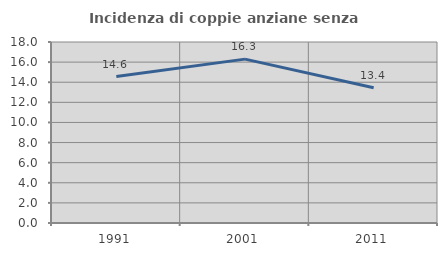
| Category | Incidenza di coppie anziane senza figli  |
|---|---|
| 1991.0 | 14.559 |
| 2001.0 | 16.296 |
| 2011.0 | 13.445 |